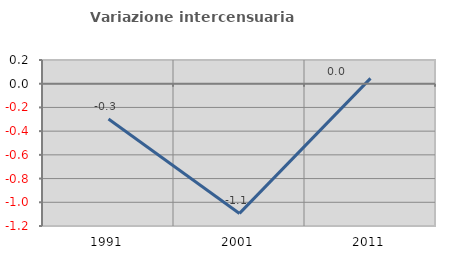
| Category | Variazione intercensuaria annua |
|---|---|
| 1991.0 | -0.297 |
| 2001.0 | -1.094 |
| 2011.0 | 0.045 |